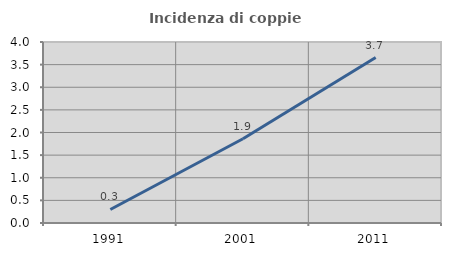
| Category | Incidenza di coppie miste |
|---|---|
| 1991.0 | 0.299 |
| 2001.0 | 1.862 |
| 2011.0 | 3.655 |